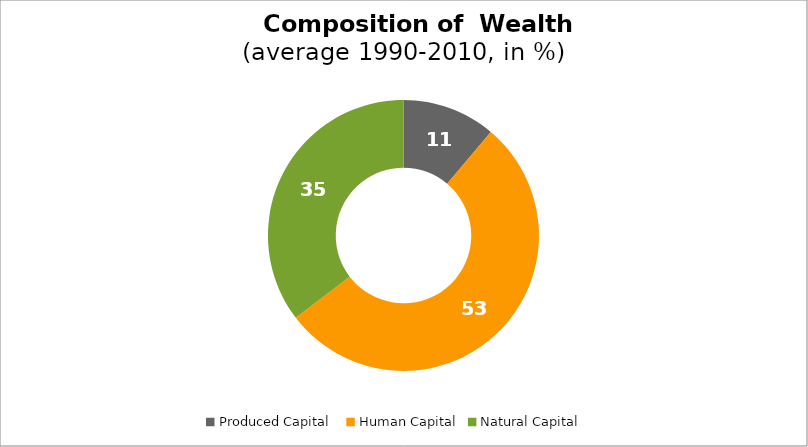
| Category | Series 0 |
|---|---|
| Produced Capital  | 11.143 |
| Human Capital | 53.474 |
| Natural Capital | 35.383 |